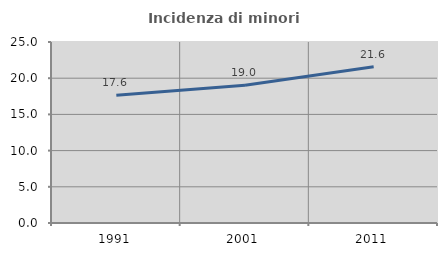
| Category | Incidenza di minori stranieri |
|---|---|
| 1991.0 | 17.647 |
| 2001.0 | 19.029 |
| 2011.0 | 21.593 |